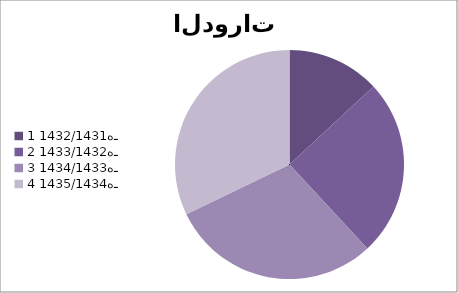
| Category | عدد الدورات  |
|---|---|
| 0 | 11 |
| 1 | 21 |
| 2 | 25 |
| 3 | 27 |